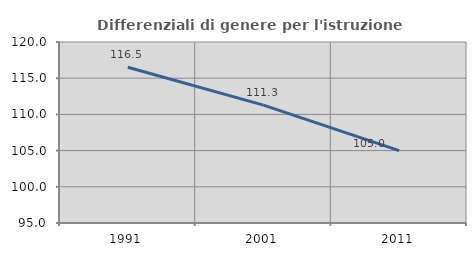
| Category | Differenziali di genere per l'istruzione superiore |
|---|---|
| 1991.0 | 116.504 |
| 2001.0 | 111.275 |
| 2011.0 | 105.006 |